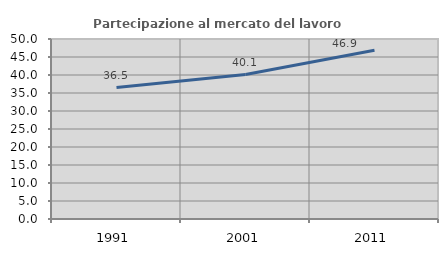
| Category | Partecipazione al mercato del lavoro  femminile |
|---|---|
| 1991.0 | 36.519 |
| 2001.0 | 40.133 |
| 2011.0 | 46.889 |